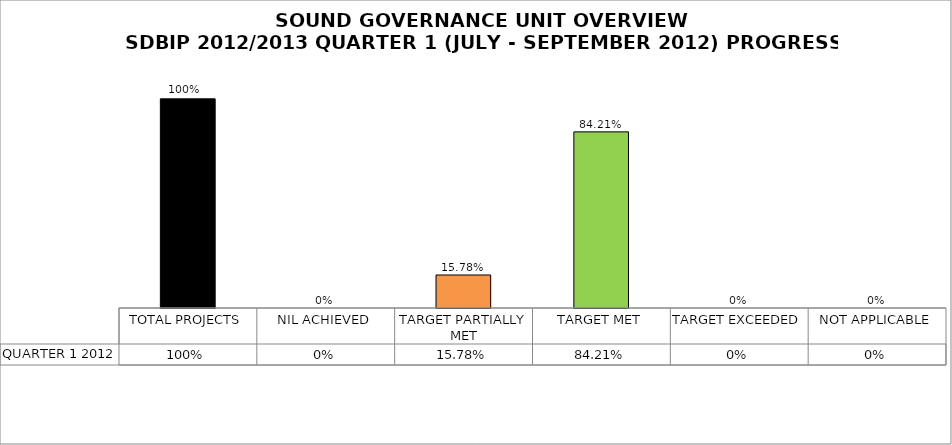
| Category | QUARTER 1 2012 |
|---|---|
| TOTAL PROJECTS | 1 |
| NIL ACHIEVED | 0 |
| TARGET PARTIALLY MET | 0.158 |
| TARGET MET | 0.842 |
| TARGET EXCEEDED | 0 |
| NOT APPLICABLE | 0 |